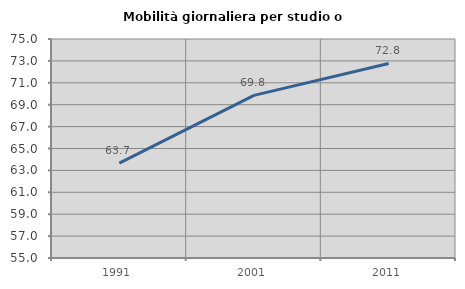
| Category | Mobilità giornaliera per studio o lavoro |
|---|---|
| 1991.0 | 63.66 |
| 2001.0 | 69.849 |
| 2011.0 | 72.765 |